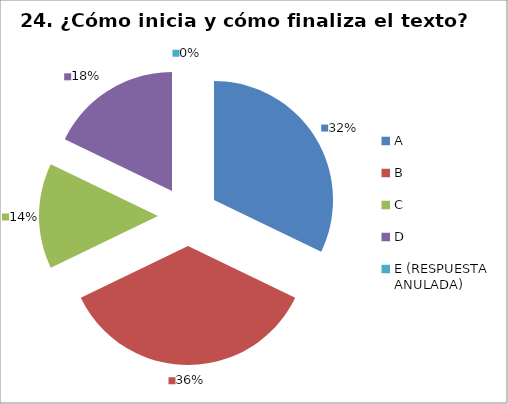
| Category | CANTIDAD DE RESPUESTAS PREGUNTA (23) | PORCENTAJE |
|---|---|---|
| A | 9 | 0.321 |
| B | 10 | 0.357 |
| C | 4 | 0.143 |
| D | 5 | 0.179 |
| E (RESPUESTA ANULADA) | 0 | 0 |